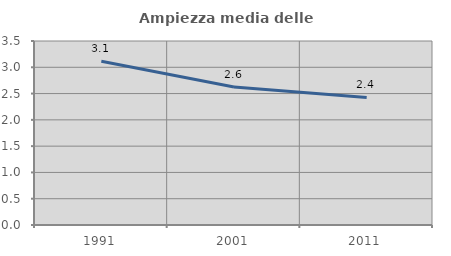
| Category | Ampiezza media delle famiglie |
|---|---|
| 1991.0 | 3.117 |
| 2001.0 | 2.627 |
| 2011.0 | 2.427 |